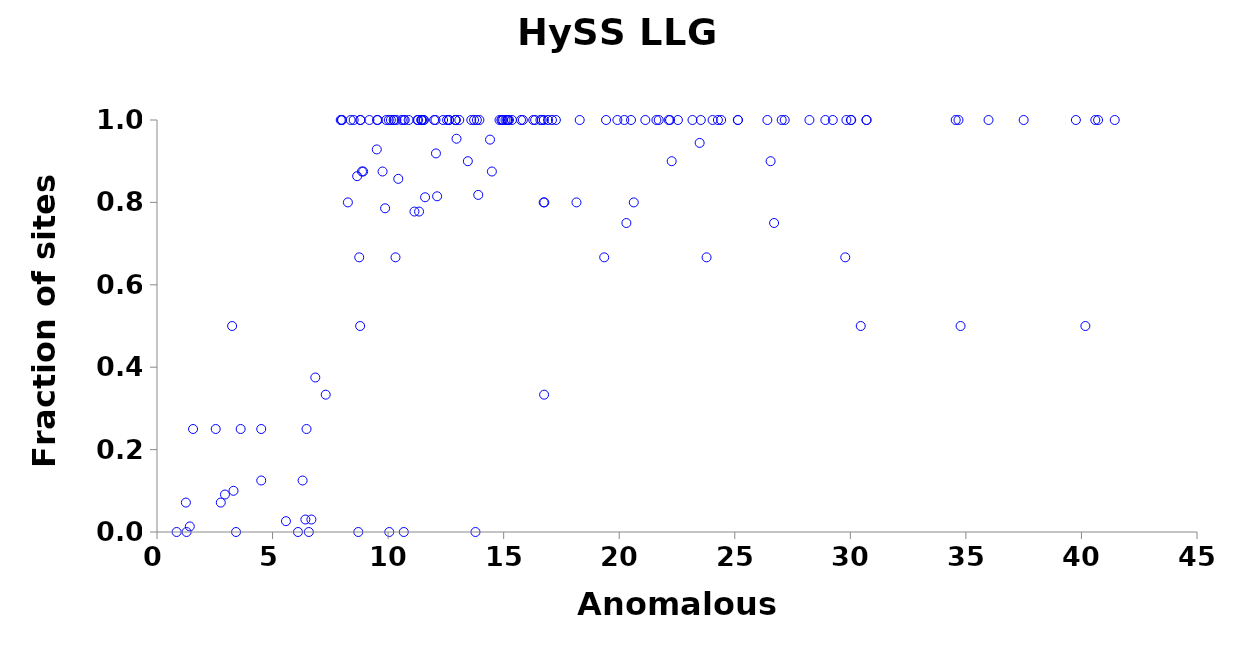
| Category | LLGC |
|---|---|
| 14.94 | 1 |
| 15.18 | 1 |
| 22.14 | 1 |
| 25.13 | 1 |
| 12.05 | 1 |
| 12.64 | 1 |
| 41.44 | 1 |
| 7.3 | 0.333 |
| 19.35 | 0.667 |
| 23.78 | 0.667 |
| 29.78 | 0.667 |
| 8.8 | 1 |
| 9.55 | 1 |
| 9.92 | 1 |
| 10.67 | 1 |
| 11.44 | 1 |
| 13.84 | 1 |
| 15.18 | 1 |
| 16.74 | 1 |
| 19.43 | 1 |
| 23.53 | 1 |
| 25.14 | 1 |
| 29.83 | 1 |
| 1.28 | 0 |
| 1.56 | 0.25 |
| 2.54 | 0.25 |
| 3.62 | 0.25 |
| 6.47 | 0.25 |
| 30.45 | 0.5 |
| 34.77 | 0.5 |
| 40.17 | 0.5 |
| 20.31 | 0.75 |
| 26.7 | 0.75 |
| 8.51 | 1 |
| 11.27 | 1 |
| 11.55 | 1 |
| 14.98 | 1 |
| 15.08 | 1 |
| 16.59 | 1 |
| 16.92 | 1 |
| 18.29 | 1 |
| 19.92 | 1 |
| 20.51 | 1 |
| 21.13 | 1 |
| 22.2 | 1 |
| 22.54 | 1 |
| 27.16 | 1 |
| 28.23 | 1 |
| 30.04 | 1 |
| 8.26 | 0.8 |
| 16.73 | 0.8 |
| 20.63 | 0.8 |
| 8.38 | 1 |
| 10.36 | 1 |
| 11.47 | 1 |
| 12.63 | 1 |
| 14.82 | 1 |
| 14.9 | 1 |
| 15.36 | 1 |
| 17.26 | 1 |
| 21.61 | 1 |
| 21.71 | 1 |
| 28.92 | 1 |
| 29.24 | 1 |
| 16.75 | 0.333 |
| 23.17 | 1 |
| 24.04 | 1 |
| 24.27 | 1 |
| 26.41 | 1 |
| 27.03 | 1 |
| 30.02 | 1 |
| 30.7 | 1 |
| 30.7 | 1 |
| 34.68 | 1 |
| 37.5 | 1 |
| 10.05 | 0 |
| 8.8 | 1 |
| 9.19 | 1 |
| 10.03 | 1 |
| 10.12 | 1 |
| 12.92 | 1 |
| 0.85 | 0 |
| 6.57 | 0 |
| 4.51 | 0.125 |
| 6.3 | 0.125 |
| 4.51 | 0.25 |
| 6.85 | 0.375 |
| 40.6 | 1 |
| 3.25 | 0.5 |
| 8.87 | 0.875 |
| 14.49 | 0.875 |
| 7.95 | 1 |
| 7.99 | 1 |
| 8.01 | 1 |
| 9.52 | 1 |
| 10.72 | 1 |
| 11.44 | 1 |
| 11.53 | 1 |
| 11.99 | 1 |
| 12.38 | 1 |
| 12.55 | 1 |
| 12.92 | 1 |
| 13.72 | 1 |
| 15.15 | 1 |
| 16.28 | 1 |
| 16.65 | 1 |
| 10.32 | 0.667 |
| 11.14 | 0.778 |
| 17.09 | 1 |
| 3.31 | 0.1 |
| 8.79 | 0.5 |
| 16.76 | 0.8 |
| 18.15 | 0.8 |
| 13.45 | 0.9 |
| 22.27 | 0.9 |
| 26.55 | 0.9 |
| 15.23 | 1 |
| 10.68 | 0 |
| 2.94 | 0.091 |
| 13.9 | 0.818 |
| 20.22 | 1 |
| 24.41 | 1 |
| 10.24 | 1 |
| 10.27 | 1 |
| 10.89 | 1 |
| 12.92 | 1 |
| 13.6 | 1 |
| 15.83 | 1 |
| 16.36 | 1 |
| 1.25 | 0.071 |
| 2.76 | 0.071 |
| 9.87 | 0.786 |
| 10.44 | 0.857 |
| 9.51 | 0.929 |
| 11.3 | 1 |
| 13.08 | 1 |
| 13.95 | 1 |
| 34.56 | 1 |
| 39.76 | 1 |
| 40.72 | 1 |
| 11.6 | 0.812 |
| 8.92 | 0.875 |
| 9.76 | 0.875 |
| 10.59 | 1 |
| 23.48 | 0.944 |
| 35.98 | 1 |
| 14.41 | 0.952 |
| 15.75 | 1 |
| 8.66 | 0.864 |
| 12.96 | 0.955 |
| 13.78 | 0 |
| 11.34 | 0.778 |
| 12.12 | 0.815 |
| 6.42 | 0.03 |
| 6.68 | 0.03 |
| 8.75 | 0.667 |
| 6.1 | 0 |
| 5.58 | 0.026 |
| 3.42 | 0 |
| 8.71 | 0 |
| 1.42 | 0.014 |
| 12.07 | 0.919 |